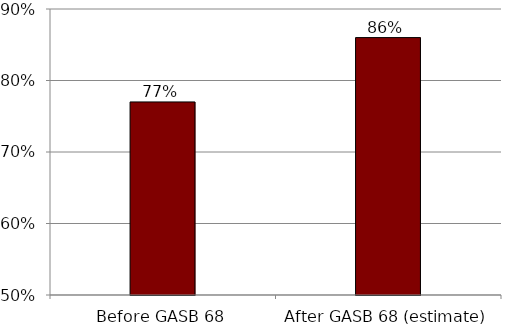
| Category | Series 0 |
|---|---|
| Before GASB 68 | 0.77 |
| After GASB 68 (estimate) | 0.86 |